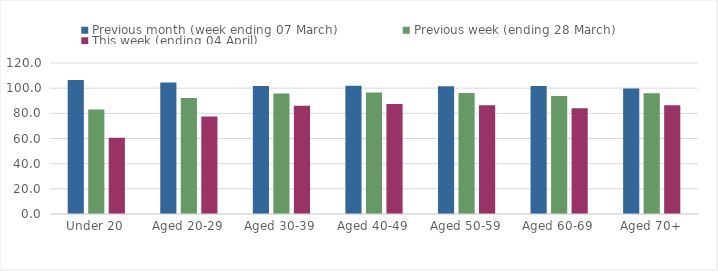
| Category | Previous month (week ending 07 March) | Previous week (ending 28 March) | This week (ending 04 April) |
|---|---|---|---|
| Under 20 | 106.521 | 82.99 | 60.512 |
| Aged 20-29 | 104.511 | 92.141 | 77.436 |
| Aged 30-39 | 101.817 | 95.829 | 86.126 |
| Aged 40-49 | 101.942 | 96.601 | 87.389 |
| Aged 50-59 | 101.539 | 96.088 | 86.487 |
| Aged 60-69 | 101.68 | 93.706 | 83.956 |
| Aged 70+ | 99.752 | 95.914 | 86.469 |